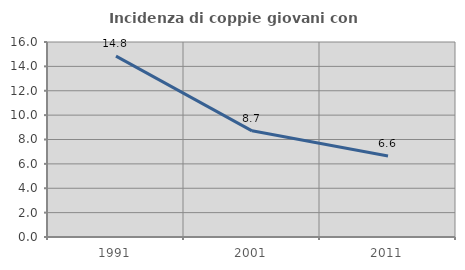
| Category | Incidenza di coppie giovani con figli |
|---|---|
| 1991.0 | 14.844 |
| 2001.0 | 8.711 |
| 2011.0 | 6.646 |